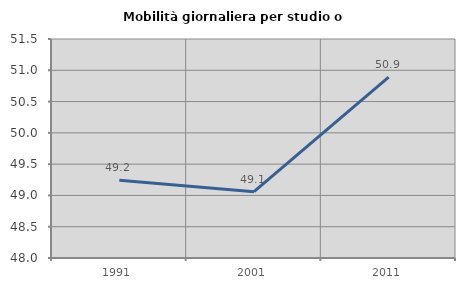
| Category | Mobilità giornaliera per studio o lavoro |
|---|---|
| 1991.0 | 49.244 |
| 2001.0 | 49.059 |
| 2011.0 | 50.891 |